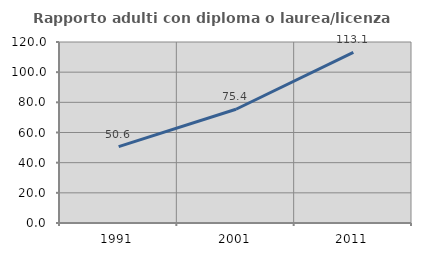
| Category | Rapporto adulti con diploma o laurea/licenza media  |
|---|---|
| 1991.0 | 50.621 |
| 2001.0 | 75.401 |
| 2011.0 | 113.089 |